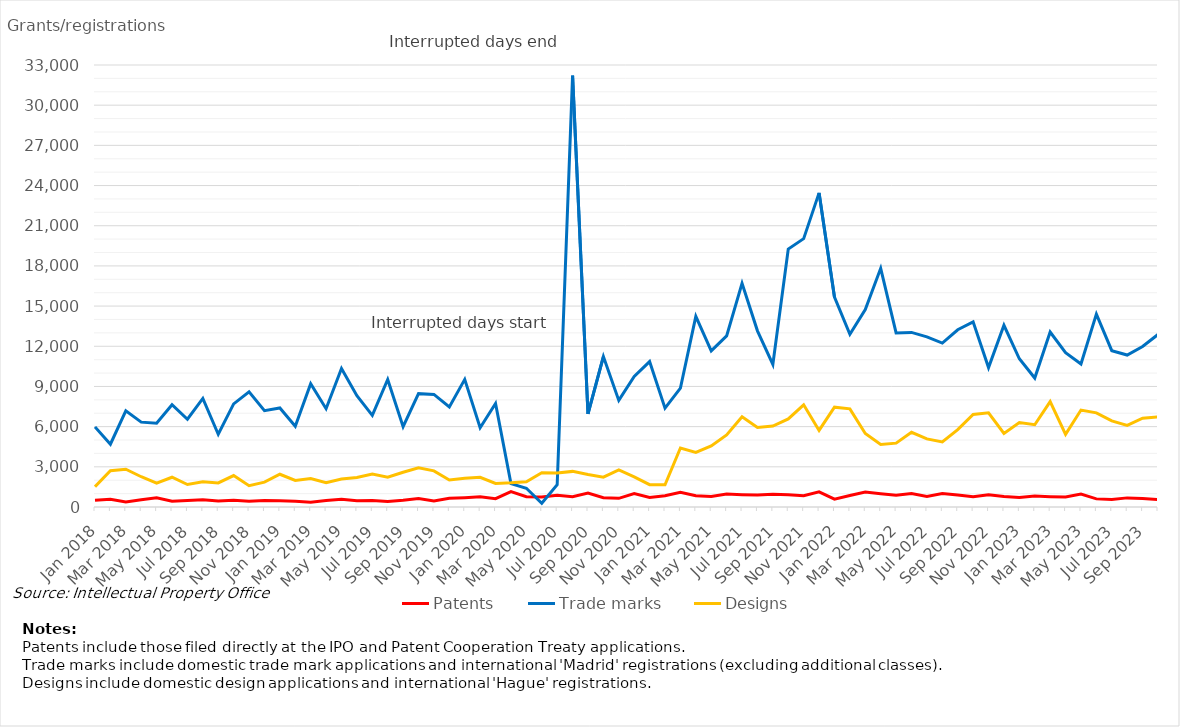
| Category | Patents | Trade marks | Designs |
|---|---|---|---|
| Jan 2018 | 495 | 5981 | 1512 |
| Feb 2018 | 574 | 4688 | 2704 |
| Mar 2018 | 370 | 7180 | 2825 |
| Apr 2018 | 543 | 6335 | 2259 |
| May 2018 | 690 | 6254 | 1789 |
| Jun 2018 | 424 | 7637 | 2222 |
| Jul 2018 | 486 | 6552 | 1678 |
| Aug 2018 | 536 | 8104 | 1878 |
| Sep 2018 | 450 | 5432 | 1795 |
| Oct 2018 | 498 | 7701 | 2348 |
| Nov 2018 | 432 | 8604 | 1592 |
| Dec 2018 | 484 | 7195 | 1859 |
| Jan 2019 | 474 | 7396 | 2444 |
| Feb 2019 | 426 | 6023 | 1987 |
| Mar 2019 | 363 | 9208 | 2125 |
| Apr 2019 | 488 | 7341 | 1810 |
| May 2019 | 573 | 10347 | 2096 |
| Jun 2019 | 471 | 8305 | 2202 |
| Jul 2019 | 489 | 6840 | 2464 |
| Aug 2019 | 420 | 9519 | 2218 |
| Sep 2019 | 500 | 5992 | 2596 |
| Oct 2019 | 634 | 8464 | 2926 |
| Nov 2019 | 455 | 8405 | 2700 |
| Dec 2019 | 654 | 7470 | 2021 |
| Jan 2020 | 696 | 9528 | 2145 |
| Feb 2020 | 756 | 5911 | 2219 |
| Mar 2020 | 622 | 7723 | 1757 |
| Apr 2020 | 1143 | 1744 | 1803 |
| May 2020 | 768 | 1400 | 1888 |
| Jun 2020 | 740 | 282 | 2564 |
| Jul 2020 | 878 | 1660 | 2539 |
| Aug 2020 | 771 | 32206 | 2659 |
| Sep 2020 | 1042 | 6950 | 2425 |
| Oct 2020 | 697 | 11228 | 2223 |
| Nov 2020 | 649 | 7958 | 2763 |
| Dec 2020 | 1010 | 9753 | 2252 |
| Jan 2021 | 708 | 10856 | 1665 |
| Feb 2021 | 838 | 7384 | 1660 |
| Mar 2021 | 1107 | 8879 | 4408 |
| Apr 2021 | 838 | 14236 | 4074 |
| May 2021 | 788 | 11656 | 4562 |
| Jun 2021 | 972 | 12775 | 5385 |
| Jul 2021 | 918 | 16701 | 6731 |
| Aug 2021 | 887 | 13153 | 5944 |
| Sep 2021 | 947 | 10650 | 6041 |
| Oct 2021 | 920 | 19256 | 6577 |
| Nov 2021 | 841 | 20034 | 7629 |
| Dec 2021 | 1131 | 23453 | 5719 |
| Jan 2022 | 585 | 15664 | 7455 |
| Feb 2022 | 860 | 12901 | 7329 |
| Mar 2022 | 1111 | 14746 | 5482 |
| Apr 2022 | 990 | 17823 | 4662 |
| May 2022 | 883 | 12996 | 4767 |
| Jun 2022 | 1010 | 13035 | 5577 |
| Jul 2022 | 788 | 12703 | 5082 |
| Aug 2022 | 1007 | 12238 | 4856 |
| Sep 2022 | 889 | 13232 | 5776 |
| Oct 2022 | 758 | 13821 | 6904 |
| Nov 2022 | 920 | 10408 | 7027 |
| Dec 2022 | 777 | 13567 | 5498 |
| Jan 2023 | 708 | 11068 | 6304 |
| Feb 2023 | 817 | 9627 | 6141 |
| Mar 2023 | 770 | 13066 | 7872 |
| Apr 2023 | 747 | 11525 | 5420 |
| May 2023 | 963 | 10678 | 7237 |
| Jun 2023 | 606 | 14401 | 7032 |
| Jul 2023 | 561 | 11674 | 6425 |
| Aug 2023 | 681 | 11345 | 6095 |
| Sep 2023 | 638 | 11981 | 6631 |
| Oct 2023 | 551 | 12881 | 6727 |